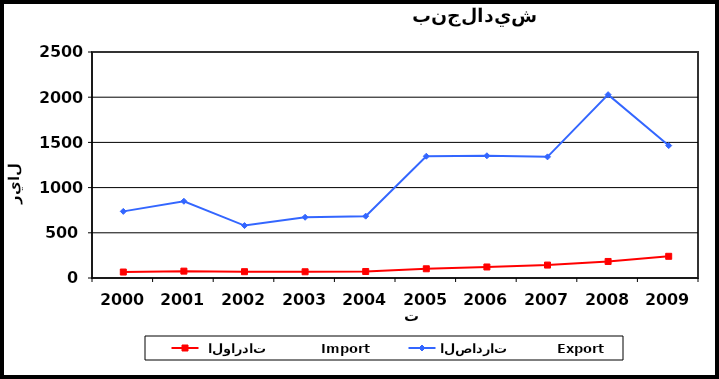
| Category |  الواردات           Import | الصادرات          Export |
|---|---|---|
| 2000.0 | 66 | 737 |
| 2001.0 | 76 | 849 |
| 2002.0 | 70 | 580 |
| 2003.0 | 69 | 672 |
| 2004.0 | 72 | 684 |
| 2005.0 | 102 | 1347 |
| 2006.0 | 122 | 1352 |
| 2007.0 | 143 | 1340 |
| 2008.0 | 183 | 2028 |
| 2009.0 | 240 | 1465 |